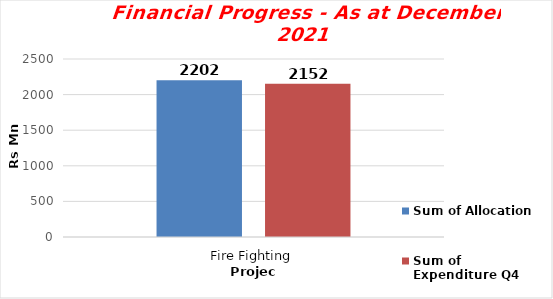
| Category | Sum of Allocation  | Sum of Expenditure Q4 |
|---|---|---|
| Fire Fighting | 2202 | 2152 |